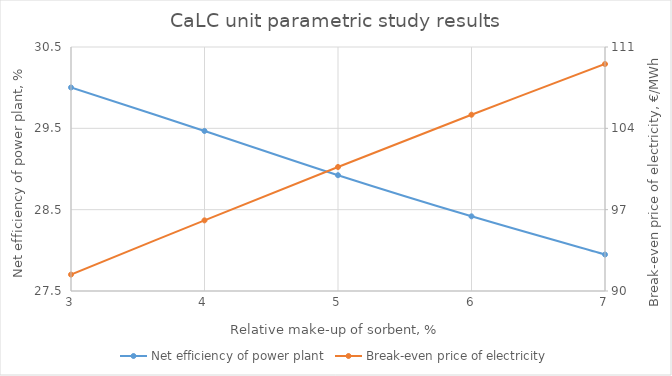
| Category | Net efficiency of power plant |
|---|---|
| 3.0 | 30.002 |
| 4.0 | 29.468 |
| 5.0 | 28.924 |
| 6.0 | 28.418 |
| 7.000000000000001 | 27.948 |